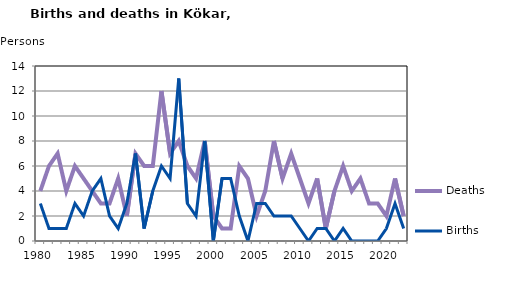
| Category | Deaths | Births |
|---|---|---|
| 1980.0 | 4 | 3 |
| 1981.0 | 6 | 1 |
| 1982.0 | 7 | 1 |
| 1983.0 | 4 | 1 |
| 1984.0 | 6 | 3 |
| 1985.0 | 5 | 2 |
| 1986.0 | 4 | 4 |
| 1987.0 | 3 | 5 |
| 1988.0 | 3 | 2 |
| 1989.0 | 5 | 1 |
| 1990.0 | 2 | 3 |
| 1991.0 | 7 | 7 |
| 1992.0 | 6 | 1 |
| 1993.0 | 6 | 4 |
| 1994.0 | 12 | 6 |
| 1995.0 | 7 | 5 |
| 1996.0 | 8 | 13 |
| 1997.0 | 6 | 3 |
| 1998.0 | 5 | 2 |
| 1999.0 | 8 | 8 |
| 2000.0 | 2 | 0 |
| 2001.0 | 1 | 5 |
| 2002.0 | 1 | 5 |
| 2003.0 | 6 | 2 |
| 2004.0 | 5 | 0 |
| 2005.0 | 2 | 3 |
| 2006.0 | 4 | 3 |
| 2007.0 | 8 | 2 |
| 2008.0 | 5 | 2 |
| 2009.0 | 7 | 2 |
| 2010.0 | 5 | 1 |
| 2011.0 | 3 | 0 |
| 2012.0 | 5 | 1 |
| 2013.0 | 1 | 1 |
| 2014.0 | 4 | 0 |
| 2015.0 | 6 | 1 |
| 2016.0 | 4 | 0 |
| 2017.0 | 5 | 0 |
| 2018.0 | 3 | 0 |
| 2019.0 | 3 | 0 |
| 2020.0 | 2 | 1 |
| 2021.0 | 5 | 3 |
| 2022.0 | 2 | 1 |